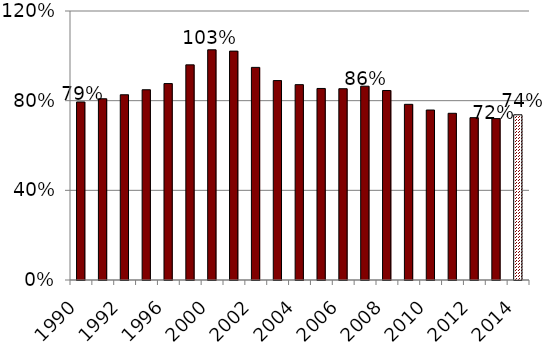
| Category | Series 0 |
|---|---|
| 1990.0 | 0.794 |
| 1991.0 | 0.808 |
| 1992.0 | 0.826 |
| 1994.0 | 0.849 |
| 1996.0 | 0.876 |
| 1998.0 | 0.96 |
| 2000.0 | 1.027 |
| 2001.0 | 1.021 |
| 2002.0 | 0.948 |
| 2003.0 | 0.89 |
| 2004.0 | 0.871 |
| 2005.0 | 0.854 |
| 2006.0 | 0.853 |
| 2007.0 | 0.865 |
| 2008.0 | 0.845 |
| 2009.0 | 0.784 |
| 2010.0 | 0.758 |
| 2011.0 | 0.744 |
| 2012.0 | 0.724 |
| 2013.0 | 0.72 |
| 2014.0 | 0.737 |